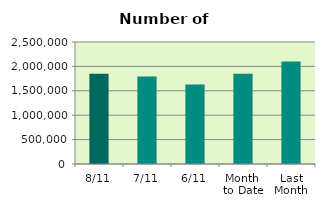
| Category | Series 0 |
|---|---|
| 8/11 | 1850958 |
| 7/11 | 1795100 |
| 6/11 | 1629416 |
| Month 
to Date | 1851505.333 |
| Last
Month | 2101052.87 |